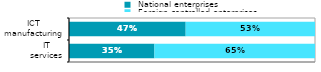
| Category |  National enterprises |  Foreign-controlled enterprises |
|---|---|---|
|  IT 
services | 0.347 | 0.653 |
|  ICT 
manufacturing | 0.474 | 0.526 |